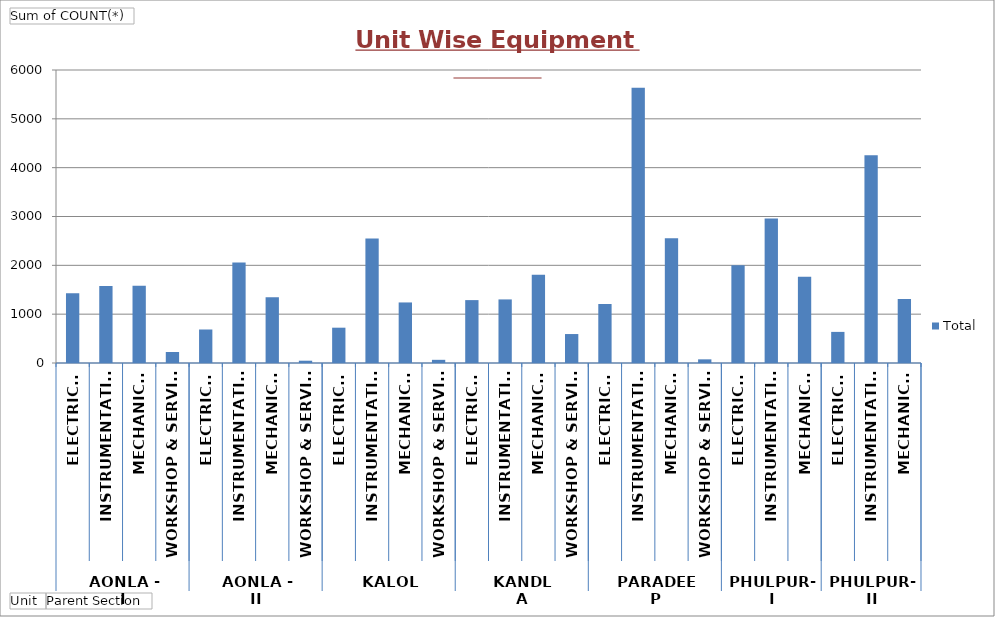
| Category | Total |
|---|---|
| 0 | 1428 |
| 1 | 1575 |
| 2 | 1583 |
| 3 | 225 |
| 4 | 686 |
| 5 | 2056 |
| 6 | 1344 |
| 7 | 47 |
| 8 | 723 |
| 9 | 2547 |
| 10 | 1240 |
| 11 | 65 |
| 12 | 1288 |
| 13 | 1302 |
| 14 | 1809 |
| 15 | 593 |
| 16 | 1208 |
| 17 | 5636 |
| 18 | 2556 |
| 19 | 75 |
| 20 | 2001 |
| 21 | 2960 |
| 22 | 1764 |
| 23 | 637 |
| 24 | 4255 |
| 25 | 1312 |